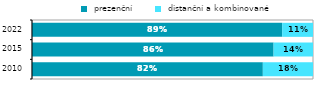
| Category |  prezenční |  distanční a kombinované |
|---|---|---|
| 2010.0 | 0.821 | 0.179 |
| 2015.0 | 0.86 | 0.14 |
| 2022.0 | 0.89 | 0.11 |